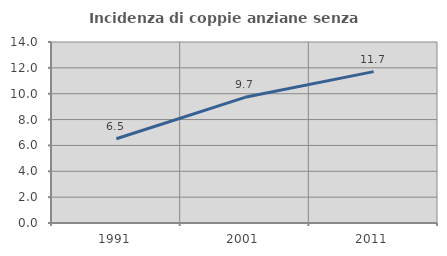
| Category | Incidenza di coppie anziane senza figli  |
|---|---|
| 1991.0 | 6.517 |
| 2001.0 | 9.721 |
| 2011.0 | 11.709 |